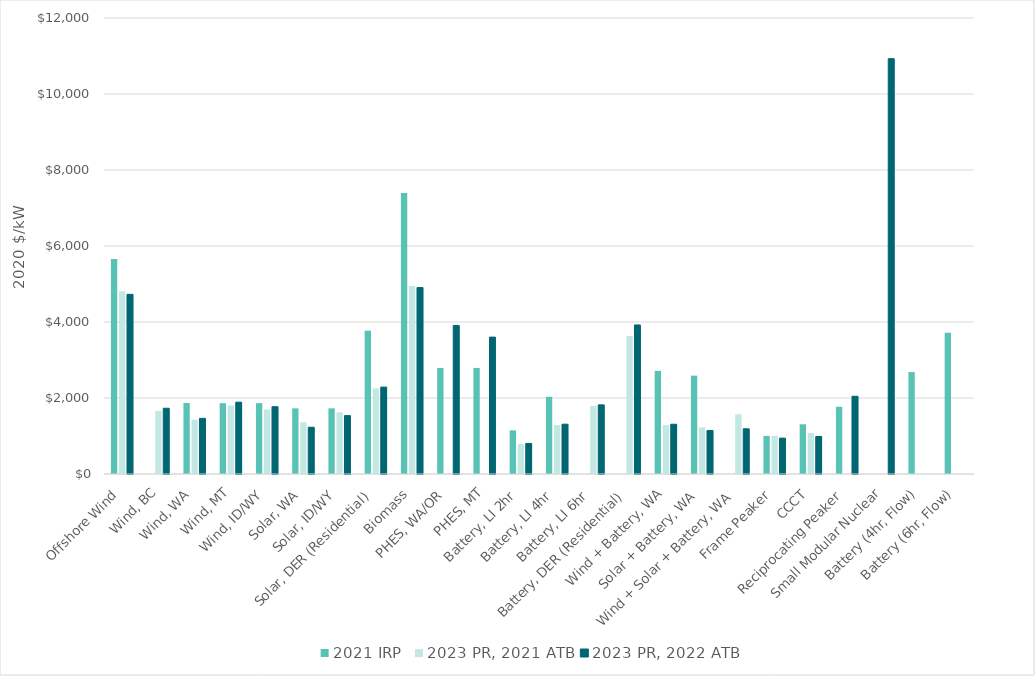
| Category | 2021 IRP  | 2023 PR, 2021 ATB | 2023 PR, 2022 ATB |
|---|---|---|---|
| Offshore Wind | 5658.1 | 4807.776 | 4728.164 |
| Wind, BC | 0 | 1660.819 | 1730.4 |
| Wind, WA | 1867.688 | 1427.556 | 1464.4 |
| Wind, MT | 1864.326 | 1801.128 | 1890.4 |
| Wind, ID/WY | 1864.326 | 1696.883 | 1771.525 |
| Solar, WA | 1727.334 | 1360.415 | 1229.784 |
| Solar, ID/WY | 1727.334 | 1624.532 | 1536.909 |
| Solar, DER (Residential) | 3771.795 | 2253.279 | 2286.984 |
| Biomass | 7396.173 | 4948.742 | 4905.547 |
| PHES, WA/OR | 2790.62 | 0 | 3910.062 |
| PHES, MT | 2790.62 | 0 | 3602.062 |
| Battery, LI 2hr | 1148.519 | 787.266 | 804.91 |
| Battery, LI 4hr | 2032.221 | 1287.348 | 1310.449 |
| Battery, LI 6hr | 0 | 1790.756 | 1819.404 |
| Battery, DER (Residential) | 0 | 3631.626 | 3922.573 |
| Wind + Battery, WA | 2714.586 | 1285.415 | 1309.435 |
| Solar + Battery, WA | 2588.268 | 1225.747 | 1145.465 |
| Wind + Solar + Battery, WA | 0 | 1572.515 | 1189.08 |
| Frame Peaker | 1002.681 | 1005.006 | 943.716 |
| CCCT | 1308.612 | 1079.154 | 987.089 |
| Reciprocating Peaker | 1768.544 | 0 | 2045.246 |
| Small Modular Nuclear | 0 | 0 | 10930.335 |
| Battery (4hr, Flow) | 2682.309 | 0 | 0 |
| Battery (6hr, Flow) | 3713.893 | 0 | 0 |